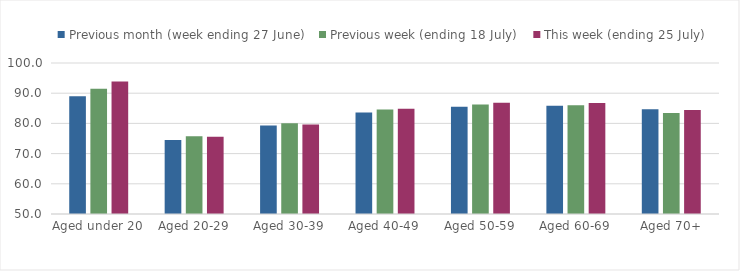
| Category | Previous month (week ending 27 June) | Previous week (ending 18 July) | This week (ending 25 July) |
|---|---|---|---|
| Aged under 20 | 88.969 | 91.469 | 93.862 |
| Aged 20-29 | 74.519 | 75.78 | 75.603 |
| Aged 30-39 | 79.284 | 80.087 | 79.663 |
| Aged 40-49 | 83.642 | 84.579 | 84.855 |
| Aged 50-59 | 85.477 | 86.273 | 86.879 |
| Aged 60-69 | 85.873 | 86.024 | 86.734 |
| Aged 70+ | 84.656 | 83.425 | 84.399 |